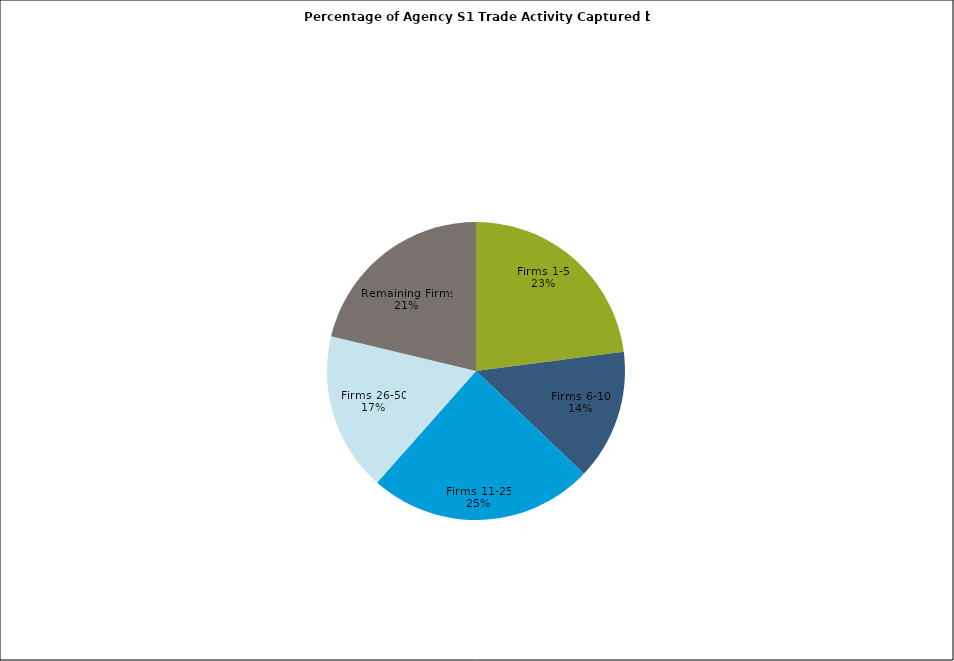
| Category | Series 0 |
|---|---|
| Firms 1-5 | 0.229 |
| Firms 6-10 | 0.142 |
| Firms 11-25 | 0.244 |
| Firms 26-50 | 0.172 |
| Remaining Firms | 0.213 |